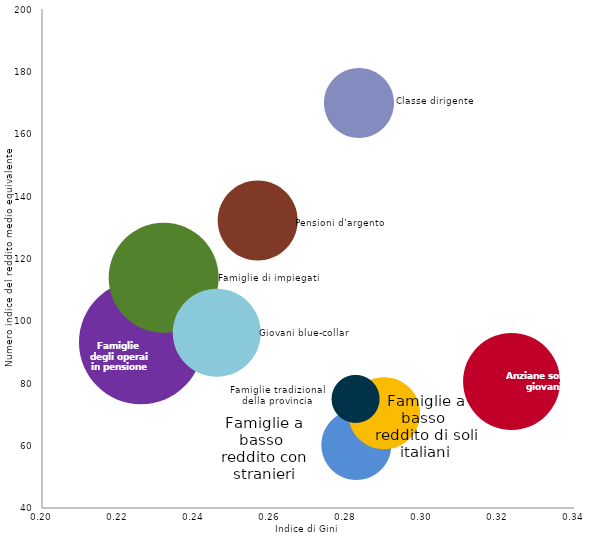
| Category | Series 0 |
|---|---|
| 0.28266 | 60.281 |
| 0.28992 | 70.533 |
| 0.22604 | 93.163 |
| 0.28241 | 75.114 |
| 0.23198 | 113.88 |
| 0.24594 | 96.215 |
| 0.32352 | 80.663 |
| 0.25668 | 132.25 |
| 0.28339 | 169.883 |